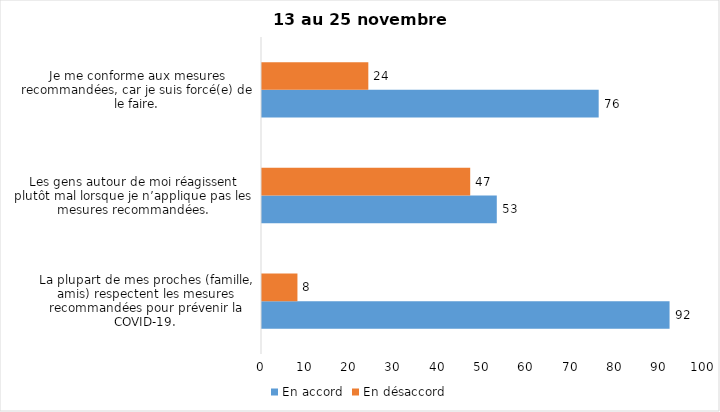
| Category | En accord | En désaccord |
|---|---|---|
| La plupart de mes proches (famille, amis) respectent les mesures recommandées pour prévenir la COVID-19. | 92 | 8 |
| Les gens autour de moi réagissent plutôt mal lorsque je n’applique pas les mesures recommandées. | 53 | 47 |
| Je me conforme aux mesures recommandées, car je suis forcé(e) de le faire. | 76 | 24 |